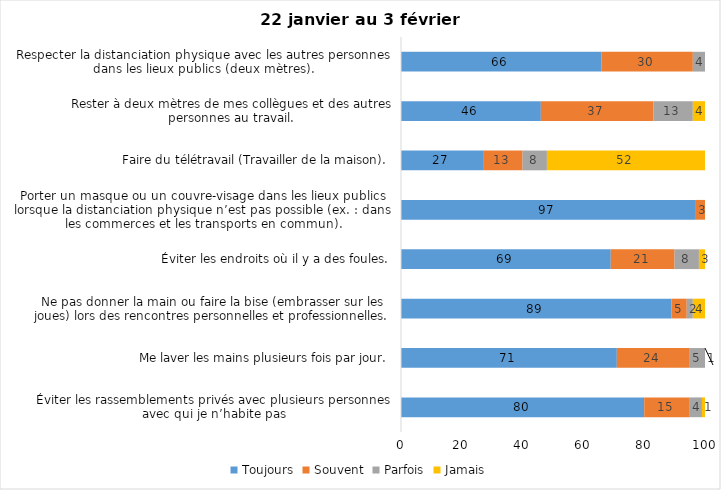
| Category | Toujours | Souvent | Parfois | Jamais |
|---|---|---|---|---|
| Éviter les rassemblements privés avec plusieurs personnes avec qui je n’habite pas | 80 | 15 | 4 | 1 |
| Me laver les mains plusieurs fois par jour. | 71 | 24 | 5 | 1 |
| Ne pas donner la main ou faire la bise (embrasser sur les joues) lors des rencontres personnelles et professionnelles. | 89 | 5 | 2 | 4 |
| Éviter les endroits où il y a des foules. | 69 | 21 | 8 | 3 |
| Porter un masque ou un couvre-visage dans les lieux publics lorsque la distanciation physique n’est pas possible (ex. : dans les commerces et les transports en commun). | 97 | 3 | 0 | 0 |
| Faire du télétravail (Travailler de la maison). | 27 | 13 | 8 | 52 |
| Rester à deux mètres de mes collègues et des autres personnes au travail. | 46 | 37 | 13 | 4 |
| Respecter la distanciation physique avec les autres personnes dans les lieux publics (deux mètres). | 66 | 30 | 4 | 0 |